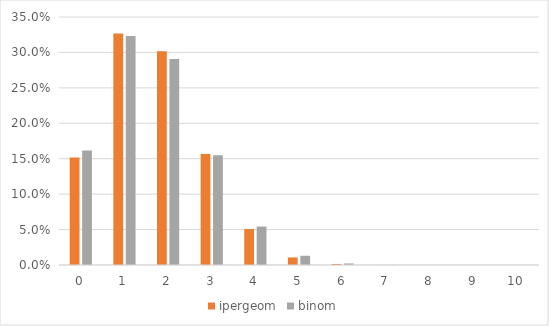
| Category | ipergeom | binom |
|---|---|---|
| 0.0 | 0.152 | 0.162 |
| 1.0 | 0.327 | 0.323 |
| 2.0 | 0.302 | 0.291 |
| 3.0 | 0.157 | 0.155 |
| 4.0 | 0.051 | 0.054 |
| 5.0 | 0.011 | 0.013 |
| 6.0 | 0.001 | 0.002 |
| 7.0 | 0 | 0 |
| 8.0 | 0 | 0 |
| 9.0 | 0 | 0 |
| 10.0 | 0 | 0 |